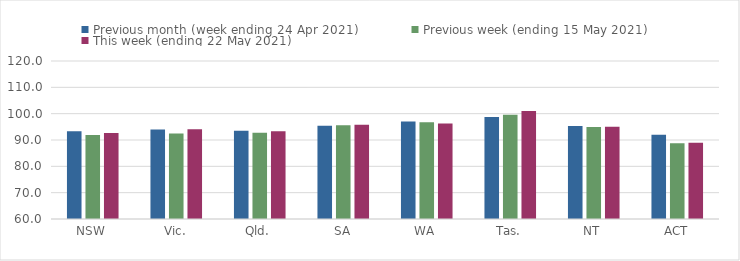
| Category | Previous month (week ending 24 Apr 2021) | Previous week (ending 15 May 2021) | This week (ending 22 May 2021) |
|---|---|---|---|
| NSW | 93.37 | 91.86 | 92.64 |
| Vic. | 94.03 | 92.43 | 94.04 |
| Qld. | 93.47 | 92.73 | 93.36 |
| SA | 95.39 | 95.63 | 95.8 |
| WA | 97.04 | 96.7 | 96.25 |
| Tas. | 98.71 | 99.62 | 101.02 |
| NT | 95.32 | 94.93 | 95.02 |
| ACT | 91.95 | 88.73 | 88.91 |